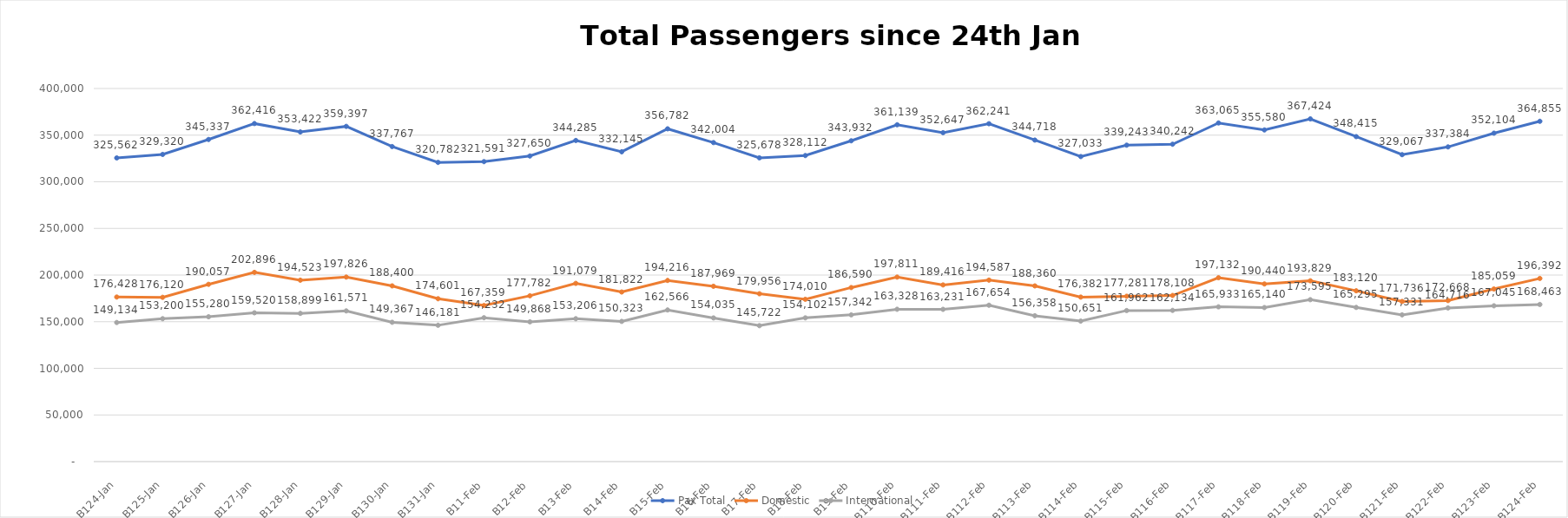
| Category | Pax Total |  Domestic  |  International  |
|---|---|---|---|
| 2023-01-24 | 325562 | 176428 | 149134 |
| 2023-01-25 | 329320 | 176120 | 153200 |
| 2023-01-26 | 345337 | 190057 | 155280 |
| 2023-01-27 | 362416 | 202896 | 159520 |
| 2023-01-28 | 353422 | 194523 | 158899 |
| 2023-01-29 | 359397 | 197826 | 161571 |
| 2023-01-30 | 337767 | 188400 | 149367 |
| 2023-01-31 | 320782 | 174601 | 146181 |
| 2023-02-01 | 321591 | 167359 | 154232 |
| 2023-02-02 | 327650 | 177782 | 149868 |
| 2023-02-03 | 344285 | 191079 | 153206 |
| 2023-02-04 | 332145 | 181822 | 150323 |
| 2023-02-05 | 356782 | 194216 | 162566 |
| 2023-02-06 | 342004 | 187969 | 154035 |
| 2023-02-07 | 325678 | 179956 | 145722 |
| 2023-02-08 | 328112 | 174010 | 154102 |
| 2023-02-09 | 343932 | 186590 | 157342 |
| 2023-02-10 | 361139 | 197811 | 163328 |
| 2023-02-11 | 352647 | 189416 | 163231 |
| 2023-02-12 | 362241 | 194587 | 167654 |
| 2023-02-13 | 344718 | 188360 | 156358 |
| 2023-02-14 | 327033 | 176382 | 150651 |
| 2023-02-15 | 339243 | 177281 | 161962 |
| 2023-02-16 | 340242 | 178108 | 162134 |
| 2023-02-17 | 363065 | 197132 | 165933 |
| 2023-02-18 | 355580 | 190440 | 165140 |
| 2023-02-19 | 367424 | 193829 | 173595 |
| 2023-02-20 | 348415 | 183120 | 165295 |
| 2023-02-21 | 329067 | 171736 | 157331 |
| 2023-02-22 | 337384 | 172668 | 164716 |
| 2023-02-23 | 352104 | 185059 | 167045 |
| 2023-02-24 | 364855 | 196392 | 168463 |